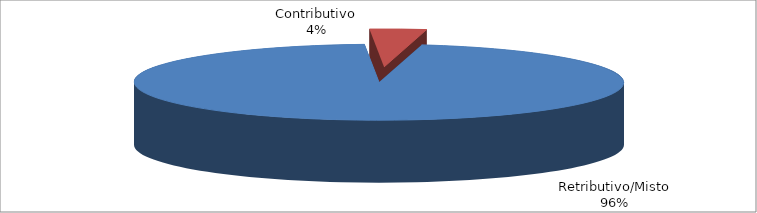
| Category | Series 1 |
|---|---|
| Retributivo/Misto | 67533 |
| Contributivo | 2616 |